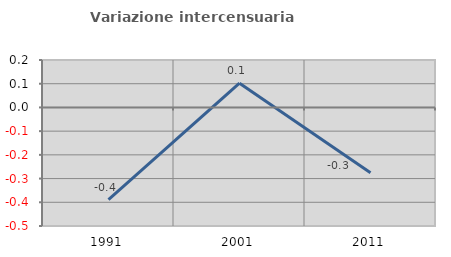
| Category | Variazione intercensuaria annua |
|---|---|
| 1991.0 | -0.389 |
| 2001.0 | 0.102 |
| 2011.0 | -0.276 |